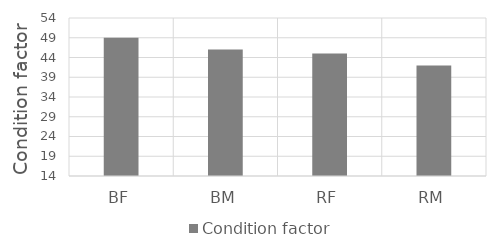
| Category | Condition factor |
|---|---|
| BF | 49 |
| BM | 46 |
| RF | 45 |
| RM | 42 |